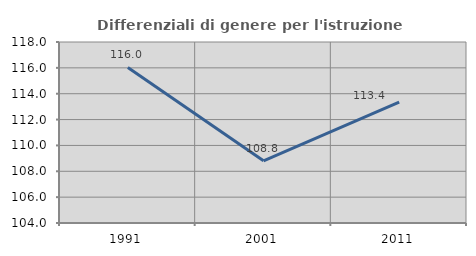
| Category | Differenziali di genere per l'istruzione superiore |
|---|---|
| 1991.0 | 116.033 |
| 2001.0 | 108.813 |
| 2011.0 | 113.359 |